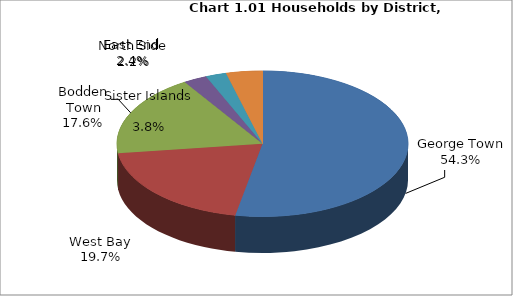
| Category | Series 0 |
|---|---|
| George Town | 11228.555 |
| West Bay | 4216.262 |
| Bodden Town | 3847.017 |
| North Side | 556.2 |
| East End | 485 |
| Sister Islands  | 855.789 |